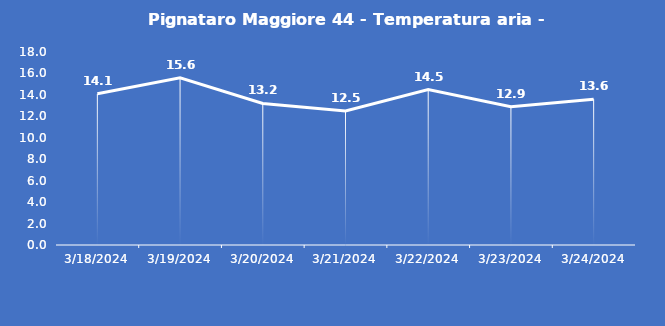
| Category | Pignataro Maggiore 44 - Temperatura aria - Grezzo (°C) |
|---|---|
| 3/18/24 | 14.1 |
| 3/19/24 | 15.6 |
| 3/20/24 | 13.2 |
| 3/21/24 | 12.5 |
| 3/22/24 | 14.5 |
| 3/23/24 | 12.9 |
| 3/24/24 | 13.6 |